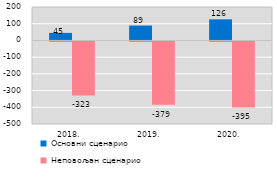
| Category | Основни сценарио | Неповољан сценарио |
|---|---|---|
| 2018.  | 45 | -323 |
| 2019.  | 89 | -379 |
| 2020.  | 126 | -395 |